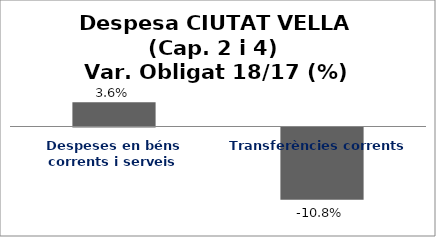
| Category | Series 0 |
|---|---|
| Despeses en béns corrents i serveis | 0.036 |
| Transferències corrents | -0.108 |